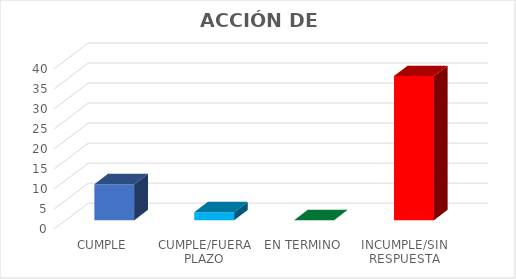
| Category | TOTAL |
|---|---|
| CUMPLE | 9 |
| CUMPLE/FUERA PLAZO | 2 |
| EN TERMINO | 0 |
| INCUMPLE/SIN RESPUESTA | 36 |